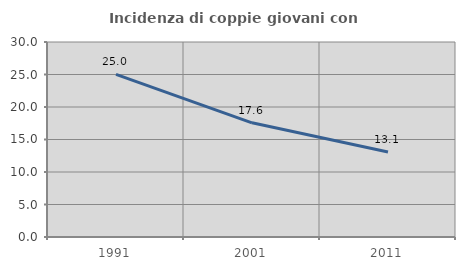
| Category | Incidenza di coppie giovani con figli |
|---|---|
| 1991.0 | 25.021 |
| 2001.0 | 17.565 |
| 2011.0 | 13.066 |